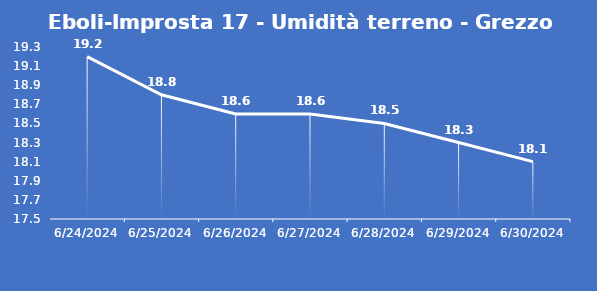
| Category | Eboli-Improsta 17 - Umidità terreno - Grezzo (%VWC) |
|---|---|
| 6/24/24 | 19.2 |
| 6/25/24 | 18.8 |
| 6/26/24 | 18.6 |
| 6/27/24 | 18.6 |
| 6/28/24 | 18.5 |
| 6/29/24 | 18.3 |
| 6/30/24 | 18.1 |